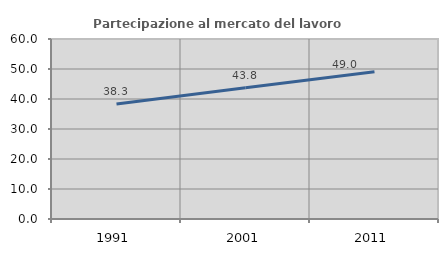
| Category | Partecipazione al mercato del lavoro  femminile |
|---|---|
| 1991.0 | 38.336 |
| 2001.0 | 43.786 |
| 2011.0 | 49.046 |